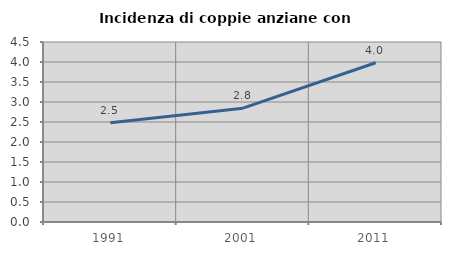
| Category | Incidenza di coppie anziane con figli |
|---|---|
| 1991.0 | 2.484 |
| 2001.0 | 2.846 |
| 2011.0 | 3.982 |